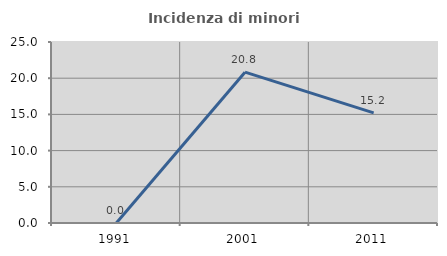
| Category | Incidenza di minori stranieri |
|---|---|
| 1991.0 | 0 |
| 2001.0 | 20.833 |
| 2011.0 | 15.217 |